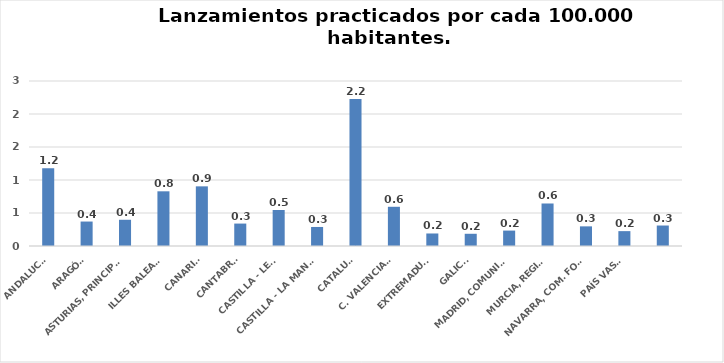
| Category | Series 0 |
|---|---|
| ANDALUCÍA | 1.178 |
| ARAGÓN | 0.371 |
| ASTURIAS, PRINCIPADO | 0.397 |
| ILLES BALEARS | 0.829 |
| CANARIAS | 0.904 |
| CANTABRIA | 0.34 |
| CASTILLA - LEÓN | 0.546 |
| CASTILLA - LA MANCHA | 0.288 |
| CATALUÑA | 2.228 |
| C. VALENCIANA | 0.594 |
| EXTREMADURA | 0.19 |
| GALICIA | 0.185 |
| MADRID, COMUNIDAD | 0.234 |
| MURCIA, REGIÓN | 0.644 |
| NAVARRA, COM. FORAL | 0.298 |
| PAÍS VASCO | 0.225 |